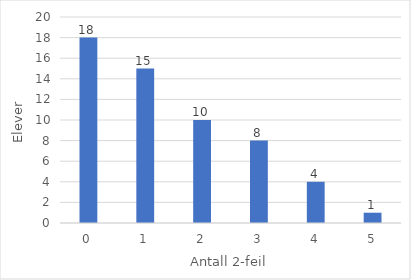
| Category | Series 0 |
|---|---|
| 0.0 | 18 |
| 1.0 | 15 |
| 2.0 | 10 |
| 3.0 | 8 |
| 4.0 | 4 |
| 5.0 | 1 |